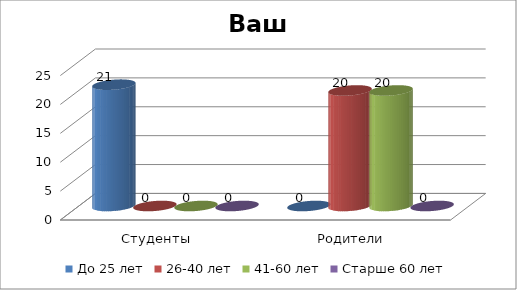
| Category | До 25 лет | 26-40 лет | 41-60 лет | Старше 60 лет |
|---|---|---|---|---|
| Студенты | 21 | 0 | 0 | 0 |
| Родители | 0 | 20 | 20 | 0 |